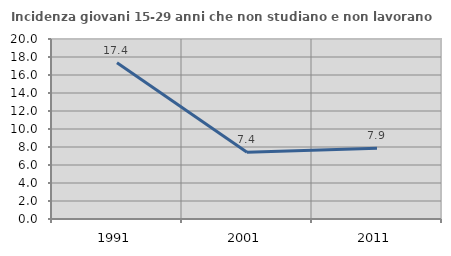
| Category | Incidenza giovani 15-29 anni che non studiano e non lavorano  |
|---|---|
| 1991.0 | 17.358 |
| 2001.0 | 7.406 |
| 2011.0 | 7.87 |